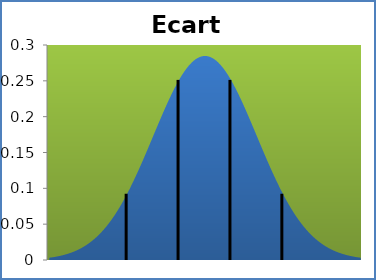
| Category | densité |
|---|---|
| -0.7530000000000001 | 0.003 |
| -0.68295 | 0.004 |
| -0.6128999999999998 | 0.004 |
| -0.5428499999999996 | 0.005 |
| -0.4727999999999999 | 0.006 |
| -0.40275000000000016 | 0.006 |
| -0.33269999999999955 | 0.007 |
| -0.26264999999999983 | 0.009 |
| -0.1926000000000001 | 0.01 |
| -0.12255000000000038 | 0.011 |
| -0.05249999999999977 | 0.013 |
| 0.017549999999999955 | 0.014 |
| 0.08760000000000012 | 0.016 |
| 0.1576500000000003 | 0.018 |
| 0.22770000000000046 | 0.02 |
| 0.2977500000000002 | 0.023 |
| 0.36780000000000035 | 0.025 |
| 0.4378500000000001 | 0.028 |
| 0.5079000000000002 | 0.031 |
| 0.57795 | 0.035 |
| 0.6480000000000001 | 0.039 |
| 0.7180499999999999 | 0.043 |
| 0.7881 | 0.047 |
| 0.8581500000000002 | 0.051 |
| 0.9282000000000004 | 0.056 |
| 0.9982500000000001 | 0.062 |
| 1.0683000000000002 | 0.067 |
| 1.13835 | 0.073 |
| 1.2084000000000001 | 0.079 |
| 1.2784500000000003 | 0.086 |
| 1.3485 | 0.092 |
| 1.4185500000000002 | 0.1 |
| 1.4886000000000001 | 0.107 |
| 1.5586500000000003 | 0.114 |
| 1.6287 | 0.122 |
| 1.6987500000000002 | 0.13 |
| 1.7688000000000001 | 0.139 |
| 1.8388500000000003 | 0.147 |
| 1.9089000000000003 | 0.155 |
| 1.9789500000000002 | 0.164 |
| 2.0490000000000004 | 0.173 |
| 2.11905 | 0.181 |
| 2.1891000000000003 | 0.19 |
| 2.25915 | 0.198 |
| 2.3292 | 0.207 |
| 2.3992500000000003 | 0.215 |
| 2.4693 | 0.223 |
| 2.53935 | 0.231 |
| 2.6094 | 0.238 |
| 2.67945 | 0.245 |
| 2.7495000000000003 | 0.251 |
| 2.8195500000000004 | 0.257 |
| 2.8896 | 0.263 |
| 2.9596500000000003 | 0.268 |
| 3.0297 | 0.272 |
| 3.0997500000000002 | 0.276 |
| 3.1698000000000004 | 0.279 |
| 3.23985 | 0.282 |
| 3.3099000000000003 | 0.283 |
| 3.37995 | 0.284 |
| 3.45 | 0.285 |
| 3.5200500000000003 | 0.284 |
| 3.5901 | 0.283 |
| 3.6601500000000002 | 0.282 |
| 3.7302 | 0.279 |
| 3.80025 | 0.276 |
| 3.8703000000000003 | 0.272 |
| 3.94035 | 0.268 |
| 4.010400000000001 | 0.263 |
| 4.08045 | 0.257 |
| 4.1505 | 0.251 |
| 4.22055 | 0.245 |
| 4.2906 | 0.238 |
| 4.360650000000001 | 0.231 |
| 4.4307 | 0.223 |
| 4.50075 | 0.215 |
| 4.5708 | 0.207 |
| 4.64085 | 0.198 |
| 4.7109000000000005 | 0.19 |
| 4.780950000000001 | 0.181 |
| 4.851 | 0.173 |
| 4.92105 | 0.164 |
| 4.9911 | 0.155 |
| 5.06115 | 0.147 |
| 5.1312 | 0.139 |
| 5.20125 | 0.13 |
| 5.2713 | 0.122 |
| 5.34135 | 0.114 |
| 5.4114 | 0.107 |
| 5.481450000000001 | 0.1 |
| 5.551500000000001 | 0.092 |
| 5.62155 | 0.086 |
| 5.6916 | 0.079 |
| 5.76165 | 0.073 |
| 5.8317 | 0.067 |
| 5.90175 | 0.062 |
| 5.9718 | 0.056 |
| 6.04185 | 0.051 |
| 6.1119 | 0.047 |
| 6.1819500000000005 | 0.043 |
| 6.252000000000001 | 0.039 |
| 6.322050000000001 | 0.035 |
| 6.3921 | 0.031 |
| 6.46215 | 0.028 |
| 6.5322 | 0.025 |
| 6.60225 | 0.023 |
| 6.6723 | 0.02 |
| 6.74235 | 0.018 |
| 6.8124 | 0.016 |
| 6.88245 | 0.014 |
| 6.952500000000001 | 0.013 |
| 7.022550000000001 | 0.011 |
| 7.092600000000001 | 0.01 |
| 7.16265 | 0.009 |
| 7.2326999999999995 | 0.007 |
| 7.3027500000000005 | 0.006 |
| 7.3728 | 0.006 |
| 7.44285 | 0.005 |
| 7.5129 | 0.004 |
| 7.58295 | 0.004 |
| 7.6530000000000005 | 0.003 |